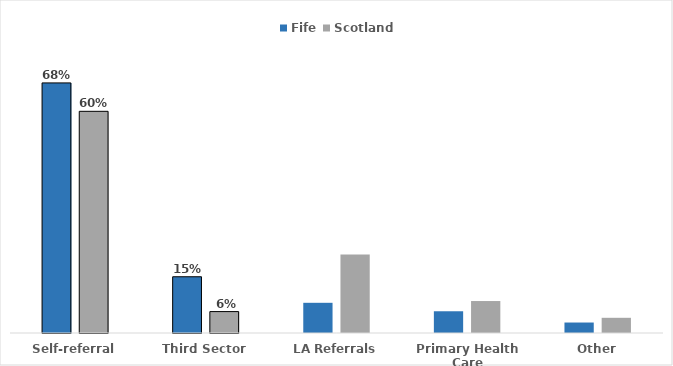
| Category | Fife | Scotland |
|---|---|---|
| Self-referral | 0.678 | 0.601 |
| Third Sector | 0.153 | 0.058 |
| LA Referrals | 0.082 | 0.213 |
| Primary Health Care | 0.059 | 0.087 |
| Other | 0.028 | 0.041 |